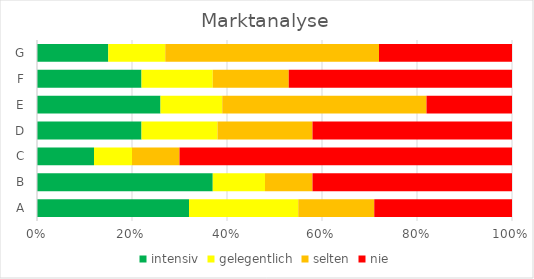
| Category | intensiv | gelegentlich | selten | nie |
|---|---|---|---|---|
| A | 0.32 | 0.23 | 0.16 | 0.29 |
| B | 0.37 | 0.11 | 0.1 | 0.42 |
| C | 0.12 | 0.08 | 0.1 | 0.7 |
| D | 0.22 | 0.16 | 0.2 | 0.42 |
| E | 0.26 | 0.13 | 0.43 | 0.18 |
| F | 0.22 | 0.15 | 0.16 | 0.47 |
| G | 0.15 | 0.12 | 0.45 | 0.28 |